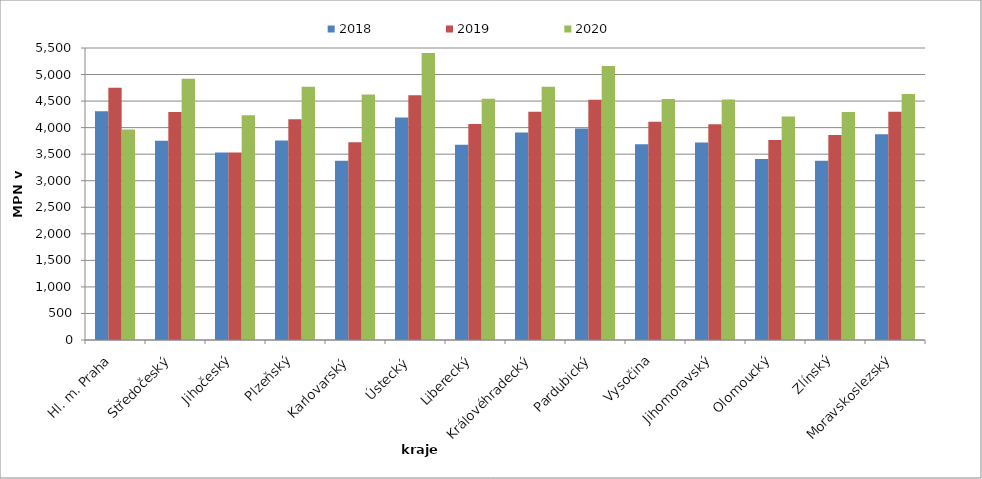
| Category | 2018 | 2019 | 2020 |
|---|---|---|---|
| Hl. m. Praha | 4308 | 4749 | 3966 |
| Středočeský | 3752 | 4294 | 4919 |
| Jihočeský | 3532 | 3532 | 4234 |
| Plzeňský | 3759 | 4160 | 4769 |
| Karlovarský  | 3377 | 3725 | 4626 |
| Ústecký   | 4191 | 4610 | 5405 |
| Liberecký | 3676 | 4067 | 4546 |
| Královéhradecký | 3908 | 4299 | 4772 |
| Pardubický | 3986 | 4526 | 5159 |
| Vysočina | 3689 | 4113 | 4538 |
| Jihomoravský | 3719 | 4062 | 4530 |
| Olomoucký | 3407 | 3765 | 4210 |
| Zlínský | 3374 | 3861 | 4294 |
| Moravskoslezský | 3874 | 4301 | 4633 |